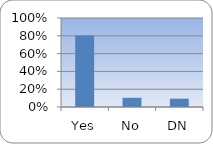
| Category | Series 0 |
|---|---|
| Yes | 0.803 |
| No | 0.103 |
| DN | 0.093 |